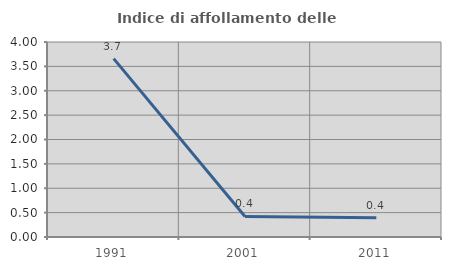
| Category | Indice di affollamento delle abitazioni  |
|---|---|
| 1991.0 | 3.659 |
| 2001.0 | 0.422 |
| 2011.0 | 0.394 |